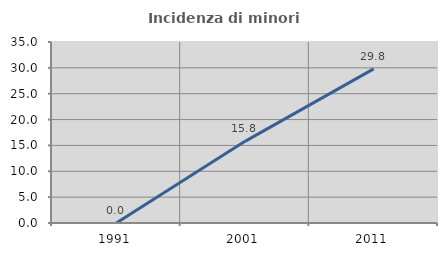
| Category | Incidenza di minori stranieri |
|---|---|
| 1991.0 | 0 |
| 2001.0 | 15.789 |
| 2011.0 | 29.811 |